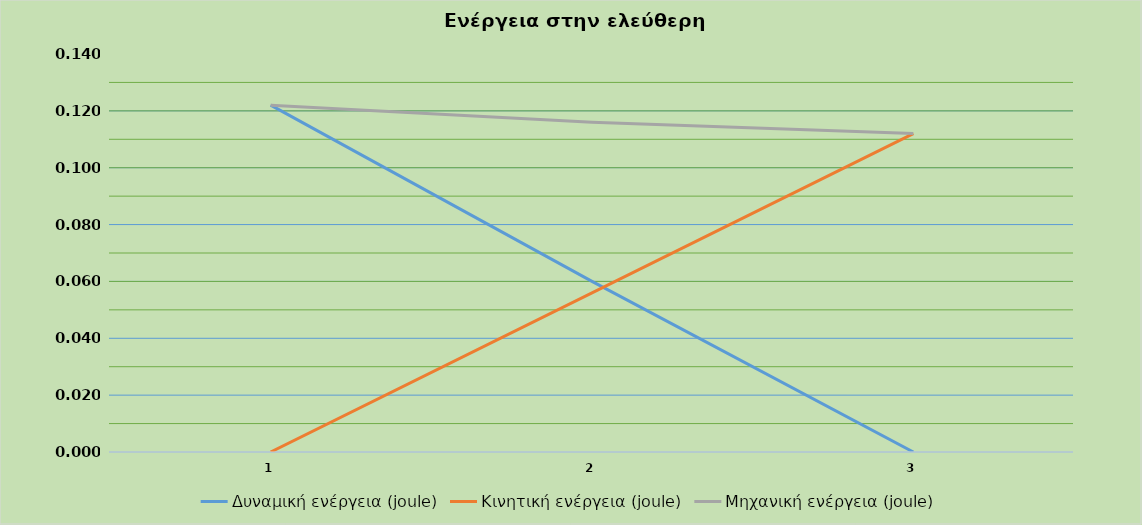
| Category | Δυναμική ενέργεια (joule) | Κινητική ενέργεια (joule) | Μηχανική ενέργεια (joule) |
|---|---|---|---|
| 0 | 0.122 | 0 | 0.122 |
| 1 | 0.06 | 0.056 | 0.116 |
| 2 | 0 | 0.112 | 0.112 |